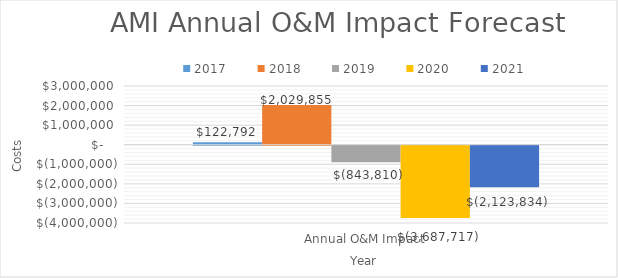
| Category | 2017 | 2018 | 2019 | 2020 | 2021 |
|---|---|---|---|---|---|
| Annual O&M Impact | 122792 | 2029854.94 | -843809.782 | -3687716.801 | -2123834.251 |